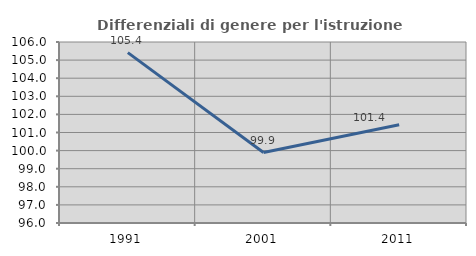
| Category | Differenziali di genere per l'istruzione superiore |
|---|---|
| 1991.0 | 105.415 |
| 2001.0 | 99.894 |
| 2011.0 | 101.426 |